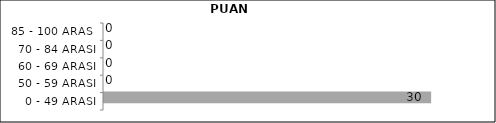
| Category | Series 0 | Series 1 | Series 2 |
|---|---|---|---|
| 0 - 49 ARASI |  |  | 30 |
| 50 - 59 ARASI |  |  | 0 |
| 60 - 69 ARASI |  |  | 0 |
| 70 - 84 ARASI |  |  | 0 |
| 85 - 100 ARASI |  |  | 0 |